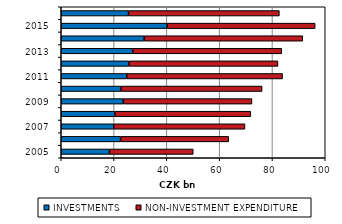
| Category | INVESTMENTS | NON-INVESTMENT EXPENDITURE |
|---|---|---|
| 2005.0 | 18248 | 31748 |
| 2006.0 | 22470 | 40981 |
| 2007.0 | 19900 | 49693 |
| 2008.0 | 20327 | 51466 |
| 2009.0 | 23491.144 | 48749.956 |
| 2010.0 | 22646.763 | 53441.341 |
| 2011.0 | 24814.074 | 59019.618 |
| 2012.0 | 25617.059 | 56470.262 |
| 2013.0 | 27074.371 | 56458.521 |
| 2014.0 | 31390.275 | 60097.937 |
| 2015.0 | 40109.604 | 56069.202 |
| 2016.0 | 25475.951 | 57145.414 |